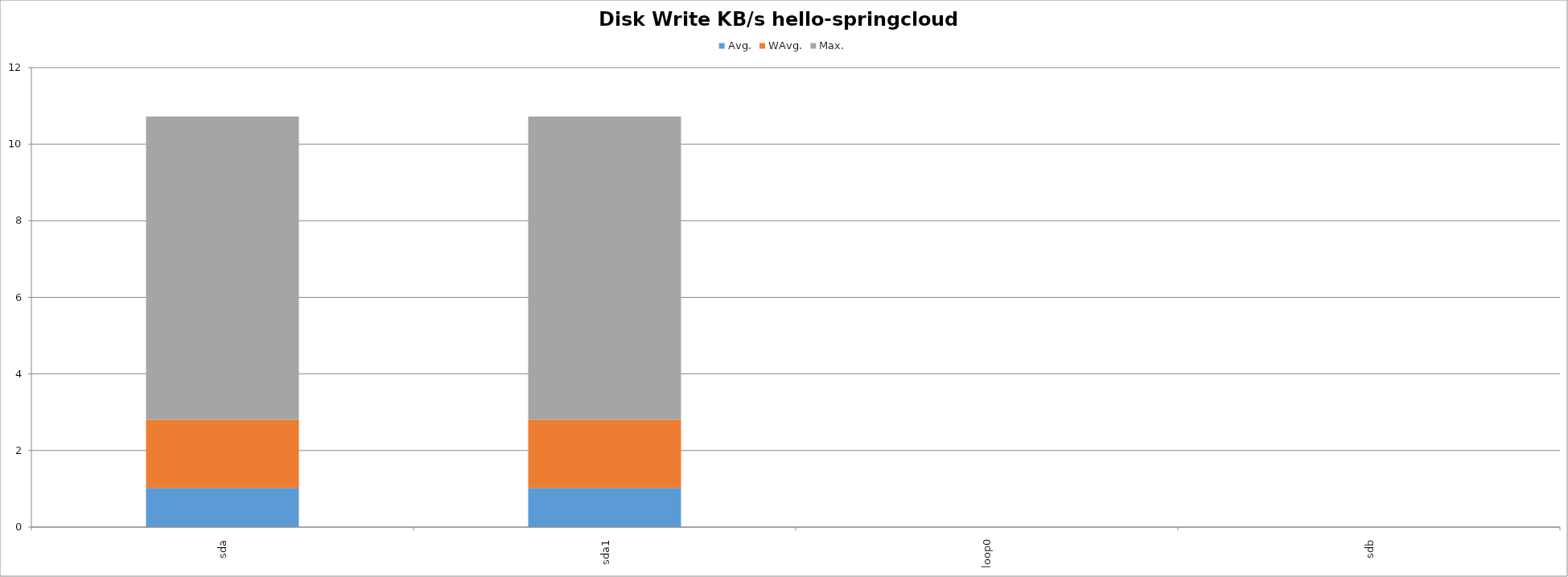
| Category | Avg. | WAvg. | Max. |
|---|---|---|---|
| sda | 1021.995 | 1784.561 | 7914.644 |
| sda1 | 1021.995 | 1784.561 | 7914.644 |
| loop0 | 0 | 0 | 0 |
| sdb | 0 | 0 | 0 |